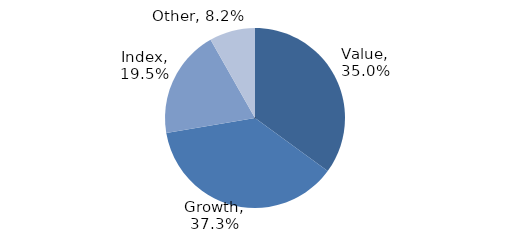
| Category | Investment Style |
|---|---|
| Value | 0.35 |
| Growth | 0.373 |
| Index | 0.195 |
| Other | 0.082 |